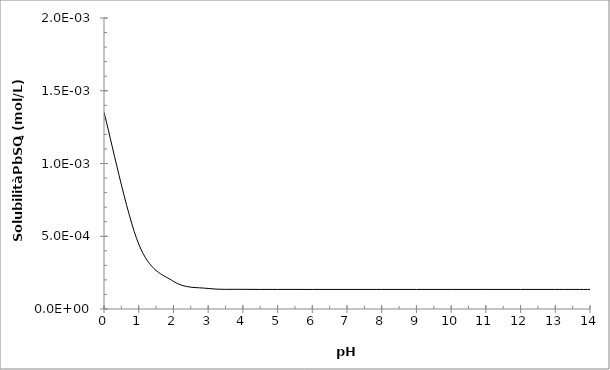
| Category | Series 0 |
|---|---|
| 0.0 | 0.001 |
| 1.0 | 0 |
| 2.0 | 0 |
| 3.0 | 0 |
| 4.0 | 0 |
| 5.0 | 0 |
| 6.0 | 0 |
| 7.0 | 0 |
| 8.0 | 0 |
| 9.0 | 0 |
| 10.0 | 0 |
| 11.0 | 0 |
| 12.0 | 0 |
| 13.0 | 0 |
| 14.0 | 0 |